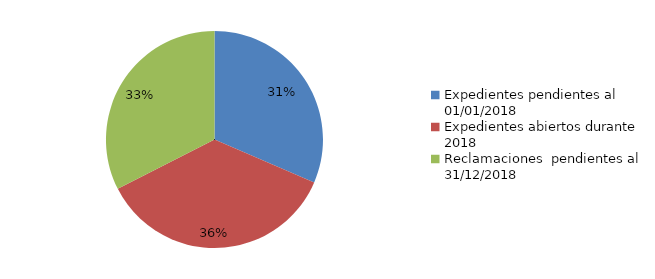
| Category | Series 0 |
|---|---|
| Expedientes pendientes al 01/01/2018 | 124 |
| Expedientes abiertos durante 2018 | 142 |
| Reclamaciones  pendientes al 31/12/2018 | 128 |